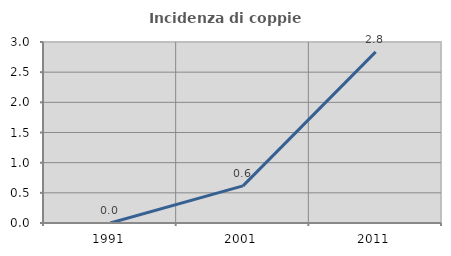
| Category | Incidenza di coppie miste |
|---|---|
| 1991.0 | 0 |
| 2001.0 | 0.616 |
| 2011.0 | 2.837 |